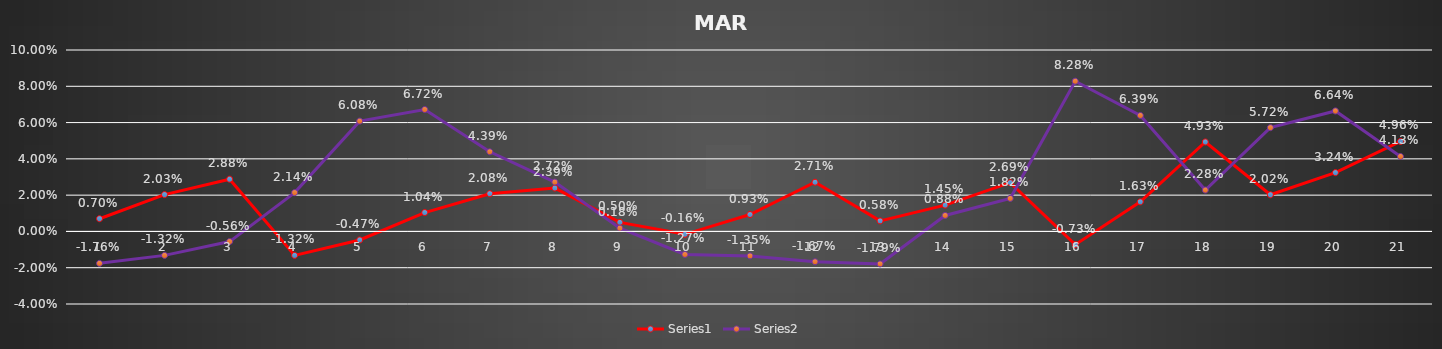
| Category | Series 0 | Series 1 |
|---|---|---|
| 0 | 0.007 | -0.018 |
| 1 | 0.02 | -0.013 |
| 2 | 0.029 | -0.006 |
| 3 | -0.013 | 0.021 |
| 4 | -0.005 | 0.061 |
| 5 | 0.01 | 0.067 |
| 6 | 0.021 | 0.044 |
| 7 | 0.024 | 0.027 |
| 8 | 0.005 | 0.002 |
| 9 | -0.002 | -0.013 |
| 10 | 0.009 | -0.014 |
| 11 | 0.027 | -0.017 |
| 12 | 0.006 | -0.018 |
| 13 | 0.014 | 0.009 |
| 14 | 0.027 | 0.018 |
| 15 | -0.007 | 0.083 |
| 16 | 0.016 | 0.064 |
| 17 | 0.049 | 0.023 |
| 18 | 0.02 | 0.057 |
| 19 | 0.032 | 0.066 |
| 20 | 0.05 | 0.041 |